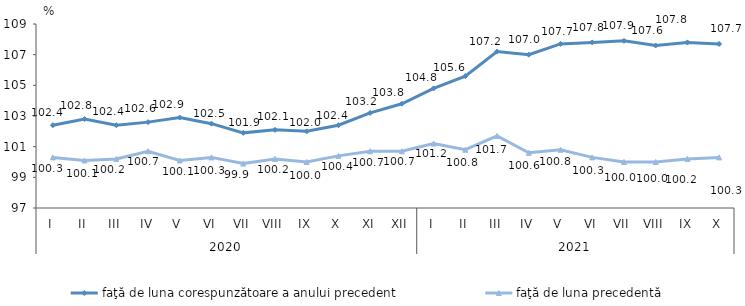
| Category | faţă de luna corespunzătoare a anului precedent | faţă de luna precedentă   |
|---|---|---|
| 0 | 102.4 | 100.3 |
| 1 | 102.8 | 100.1 |
| 2 | 102.4 | 100.2 |
| 3 | 102.6 | 100.7 |
| 4 | 102.9 | 100.1 |
| 5 | 102.5 | 100.3 |
| 6 | 101.9 | 99.9 |
| 7 | 102.1 | 100.2 |
| 8 | 102 | 100 |
| 9 | 102.4 | 100.4 |
| 10 | 103.2 | 100.7 |
| 11 | 103.8 | 100.7 |
| 12 | 104.8 | 101.2 |
| 13 | 105.6 | 100.8 |
| 14 | 107.2 | 101.7 |
| 15 | 107 | 100.6 |
| 16 | 107.7 | 100.8 |
| 17 | 107.8 | 100.3 |
| 18 | 107.9 | 100 |
| 19 | 107.6 | 100 |
| 20 | 107.8 | 100.2 |
| 21 | 107.7 | 100.3 |